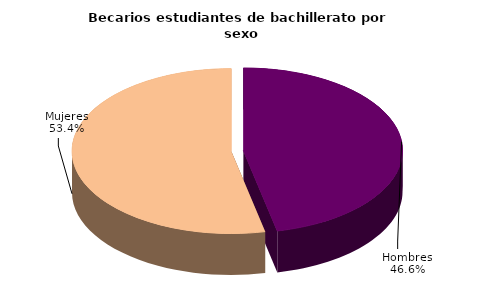
| Category | Series 0 |
|---|---|
| Hombres | 35438 |
| Mujeres | 40646 |